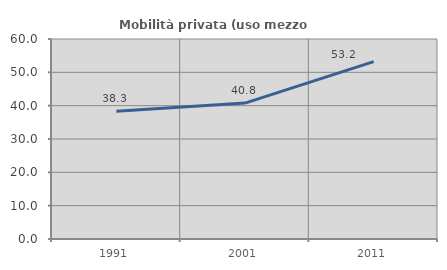
| Category | Mobilità privata (uso mezzo privato) |
|---|---|
| 1991.0 | 38.303 |
| 2001.0 | 40.781 |
| 2011.0 | 53.191 |